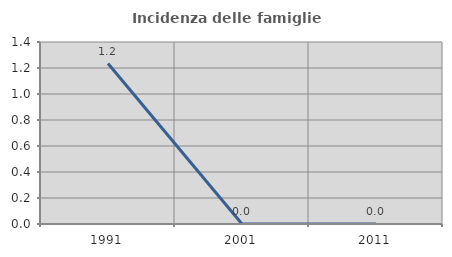
| Category | Incidenza delle famiglie numerose |
|---|---|
| 1991.0 | 1.235 |
| 2001.0 | 0 |
| 2011.0 | 0 |